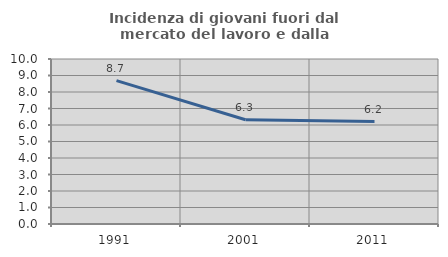
| Category | Incidenza di giovani fuori dal mercato del lavoro e dalla formazione  |
|---|---|
| 1991.0 | 8.691 |
| 2001.0 | 6.316 |
| 2011.0 | 6.207 |